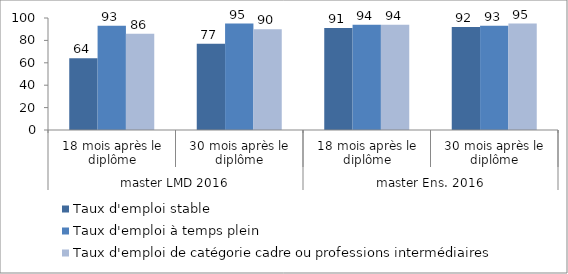
| Category | Taux d'emploi stable | Taux d'emploi à temps plein | Taux d'emploi de catégorie cadre ou professions intermédiaires |
|---|---|---|---|
| 0 | 64 | 93 | 86 |
| 1 | 77 | 95 | 90 |
| 2 | 91 | 94 | 94 |
| 3 | 92 | 93 | 95 |